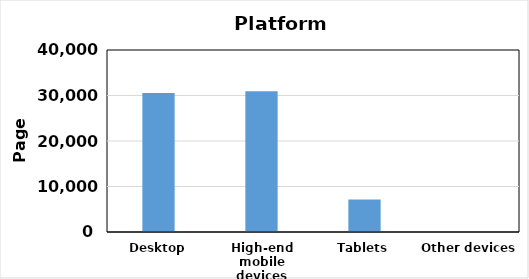
| Category | Page views |
|---|---|
| Desktop | 30528 |
| High-end mobile devices | 30912 |
| Tablets | 7143 |
| Other devices | 14 |